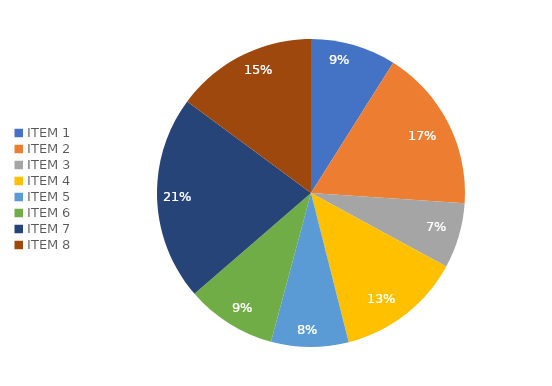
| Category | Series 0 | Series 1 |
|---|---|---|
| ITEM 1 | 0.09 | 0.09 |
| ITEM 2 | 0.171 | 0.171 |
| ITEM 3 | 0.069 | 0.069 |
| ITEM 4 | 0.131 | 0.131 |
| ITEM 5 | 0.081 | 0.081 |
| ITEM 6 | 0.095 | 0.095 |
| ITEM 7 | 0.215 | 0.215 |
| ITEM 8 | 0.149 | 0.149 |